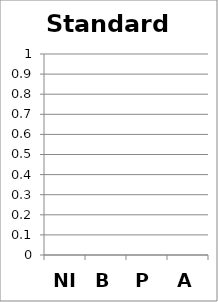
| Category | Standard 7 |
|---|---|
| NI | 0 |
| B | 0 |
| P | 0 |
| A | 0 |